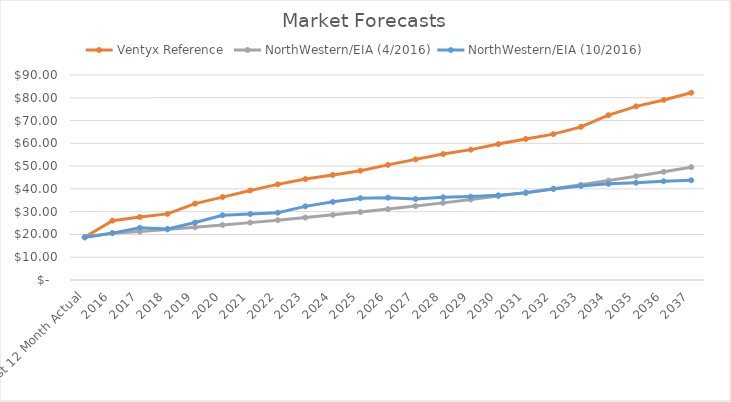
| Category | Ventyx Reference | NorthWestern/EIA (4/2016) | NorthWestern/EIA (10/2016) |
|---|---|---|---|
| Last 12 Month Actual | 18.78 | 18.78 | 18.78 |
| 2016 | 26.04 | 20.57 | 20.57 |
| 2017 | 27.66 | 21.27 | 22.937 |
| 2018 | 29.02 | 22.19 | 22.368 |
| 2019 | 33.54 | 23.15 | 25.227 |
| 2020 | 36.4 | 24.15 | 28.437 |
| 2021 | 39.3 | 25.19 | 28.966 |
| 2022 | 41.98 | 26.28 | 29.549 |
| 2023 | 44.33 | 27.41 | 32.333 |
| 2024 | 46.14 | 28.6 | 34.309 |
| 2025 | 47.99 | 29.83 | 35.925 |
| 2026 | 50.54 | 31.12 | 36.138 |
| 2027 | 52.95 | 32.46 | 35.547 |
| 2028 | 55.31 | 33.86 | 36.305 |
| 2029 | 57.23 | 35.33 | 36.61 |
| 2030 | 59.68 | 36.85 | 37.178 |
| 2031 | 61.9 | 38.44 | 38.25 |
| 2032 | 64.03 | 40.1 | 39.997 |
| 2033 | 67.23 | 41.83 | 41.289 |
| 2034 | 72.37 | 43.64 | 42.207 |
| 2035 | 76.23 | 45.52 | 42.688 |
| 2036 | 79.05 | 47.49 | 43.351 |
| 2037 | 82.21 | 49.54 | 43.783 |